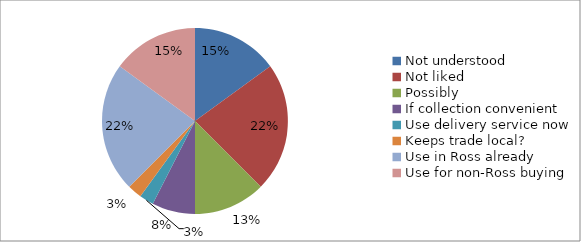
| Category | Series 2 | Series 1 | Series 0 |
|---|---|---|---|
| Not understood | 6 |  |  |
| Not liked | 9 |  |  |
| Possibly | 5 |  |  |
| If collection convenient | 3 |  |  |
| Use delivery service now | 1 |  |  |
| Keeps trade local? | 1 |  |  |
| Use in Ross already | 9 |  |  |
| Use for non-Ross buying | 6 |  |  |